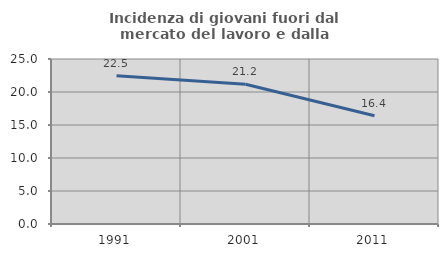
| Category | Incidenza di giovani fuori dal mercato del lavoro e dalla formazione  |
|---|---|
| 1991.0 | 22.461 |
| 2001.0 | 21.166 |
| 2011.0 | 16.403 |